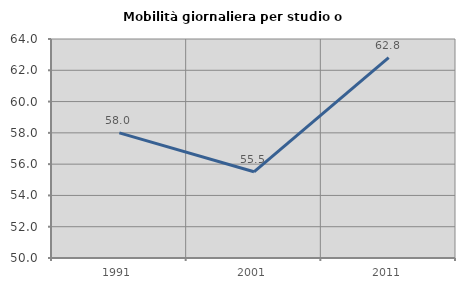
| Category | Mobilità giornaliera per studio o lavoro |
|---|---|
| 1991.0 | 58 |
| 2001.0 | 55.51 |
| 2011.0 | 62.81 |